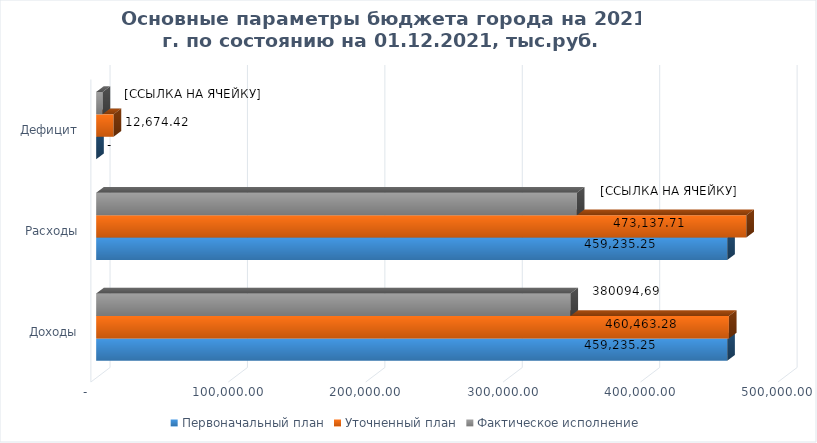
| Category | Первоначальный план | Уточненный план | Фактическое исполнение |
|---|---|---|---|
| Доходы | 459235.253 | 460463.284 | 345115.266 |
| Расходы | 459235.253 | 473137.706 | 349787.361 |
| Дефицит | 0 | 12674.422 | 4672.095 |